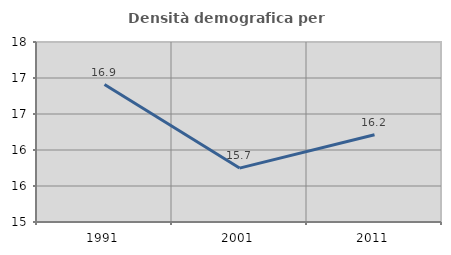
| Category | Densità demografica |
|---|---|
| 1991.0 | 16.908 |
| 2001.0 | 15.749 |
| 2011.0 | 16.213 |